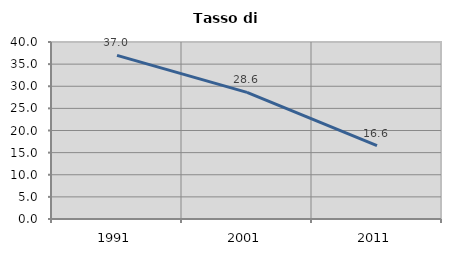
| Category | Tasso di disoccupazione   |
|---|---|
| 1991.0 | 36.977 |
| 2001.0 | 28.626 |
| 2011.0 | 16.598 |